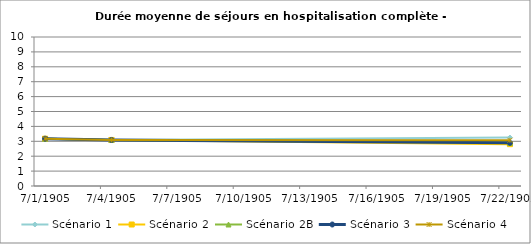
| Category | Scénario 1 | Scénario 2 | Scénario 2B | Scénario 3 | Scénario 4 |
|---|---|---|---|---|---|
| 2009.0 | 3.175 | 3.175 | 3.175 | 3.175 | 3.175 |
| 2012.0 | 3.09 | 3.09 | 3.09 | 3.09 | 3.09 |
| 2030.0 | 3.253 | 2.808 | 2.896 | 2.896 | 3.066 |